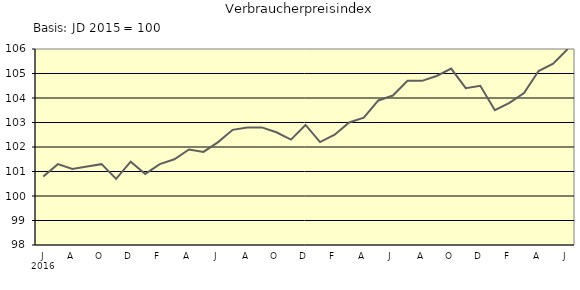
| Category | Series 0 |
|---|---|
| 0 | 100.8 |
| 1 | 101.3 |
| 2 | 101.1 |
| 3 | 101.2 |
| 4 | 101.3 |
| 5 | 100.7 |
| 6 | 101.4 |
| 7 | 100.9 |
| 8 | 101.3 |
| 9 | 101.5 |
| 10 | 101.9 |
| 11 | 101.8 |
| 12 | 102.2 |
| 13 | 102.7 |
| 14 | 102.8 |
| 15 | 102.8 |
| 16 | 102.6 |
| 17 | 102.3 |
| 18 | 102.9 |
| 19 | 102.2 |
| 20 | 102.5 |
| 21 | 103 |
| 22 | 103.2 |
| 23 | 103.9 |
| 24 | 104.1 |
| 25 | 104.7 |
| 26 | 104.7 |
| 27 | 104.9 |
| 28 | 105.2 |
| 29 | 104.4 |
| 30 | 104.5 |
| 31 | 103.5 |
| 32 | 103.8 |
| 33 | 104.2 |
| 34 | 105.1 |
| 35 | 105.4 |
| 36 | 106 |